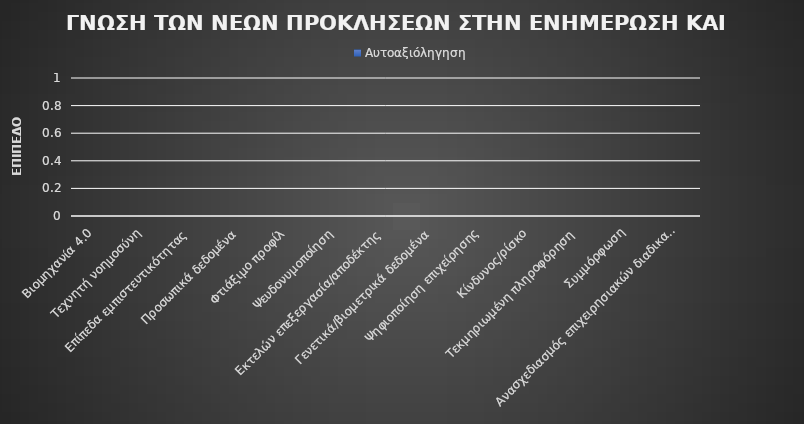
| Category | Αυτοαξιόληγηση |
|---|---|
| Βιομηχανία 4.0 | 0 |
| Τεχνητή νοημοσύνη | 0 |
| Επίπεδα εμπιστευτικότητας | 0 |
| Προσωπικά δεδομένα | 0 |
| Φτιάξιμο προφίλ | 0 |
| Ψευδονυμοποίηση | 0 |
| Εκτελών επεξεργασία/αποδέκτης | 0 |
| Γενετικά/βιομετρικά δεδομένα | 0 |
| Ψηφιοποίηση επιχείρησης | 0 |
| Κίνδυνος/ρίσκο | 0 |
| Τεκμηριωμένη πληροφόρηση  | 0 |
| Συμμόρφωση | 0 |
| Ανασχεδιασμός επιχειρησιακών διαδικασιών | 0 |